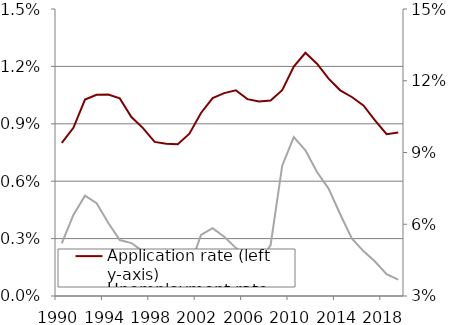
| Category | Application rate (left y-axis) |
|---|---|
| 1990.0 | 0.008 |
| 1991.0 | 0.009 |
| 1992.0 | 0.01 |
| 1993.0 | 0.011 |
| 1994.0 | 0.011 |
| 1995.0 | 0.01 |
| 1996.0 | 0.009 |
| 1997.0 | 0.009 |
| 1998.0 | 0.008 |
| 1999.0 | 0.008 |
| 2000.0 | 0.008 |
| 2001.0 | 0.008 |
| 2002.0 | 0.01 |
| 2003.0 | 0.01 |
| 2004.0 | 0.011 |
| 2005.0 | 0.011 |
| 2006.0 | 0.01 |
| 2007.0 | 0.01 |
| 2008.0 | 0.01 |
| 2009.0 | 0.011 |
| 2010.0 | 0.012 |
| 2011.0 | 0.013 |
| 2012.0 | 0.012 |
| 2013.0 | 0.011 |
| 2014.0 | 0.011 |
| 2015.0 | 0.01 |
| 2016.0 | 0.01 |
| 2017.0 | 0.009 |
| 2018.0 | 0.008 |
| 2019.0 | 0.009 |